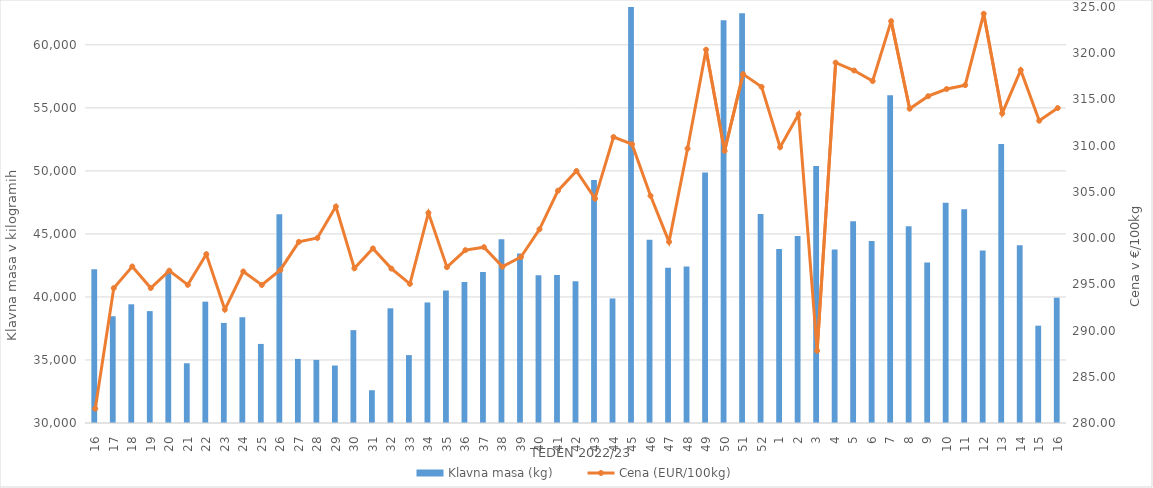
| Category | Klavna masa (kg) |
|---|---|
| 16.0 | 42191 |
| 17.0 | 38469 |
| 18.0 | 39417 |
| 19.0 | 38876 |
| 20.0 | 42047 |
| 21.0 | 34739 |
| 22.0 | 39626 |
| 23.0 | 37939 |
| 24.0 | 38390 |
| 25.0 | 36272 |
| 26.0 | 46553 |
| 27.0 | 35085 |
| 28.0 | 35007 |
| 29.0 | 34559 |
| 30.0 | 37366 |
| 31.0 | 32599 |
| 32.0 | 39100 |
| 33.0 | 35388 |
| 34.0 | 39563 |
| 35.0 | 40507 |
| 36.0 | 41176 |
| 37.0 | 41983 |
| 38.0 | 44572 |
| 39.0 | 43447 |
| 40.0 | 41711 |
| 41.0 | 41736 |
| 42.0 | 41239 |
| 43.0 | 49284 |
| 44.0 | 39877 |
| 45.0 | 63668 |
| 46.0 | 44528 |
| 47.0 | 42319 |
| 48.0 | 42416 |
| 49.0 | 49873 |
| 50.0 | 61942 |
| 51.0 | 62514 |
| 52.0 | 46589 |
| 1.0 | 43807 |
| 2.0 | 44834 |
| 3.0 | 50386 |
| 4.0 | 43773 |
| 5.0 | 46011 |
| 6.0 | 44439 |
| 7.0 | 56001 |
| 8.0 | 45613 |
| 9.0 | 42730 |
| 10.0 | 47471 |
| 11.0 | 46952 |
| 12.0 | 43683 |
| 13.0 | 52135 |
| 14.0 | 44103 |
| 15.0 | 37719 |
| 16.0 | 39943 |